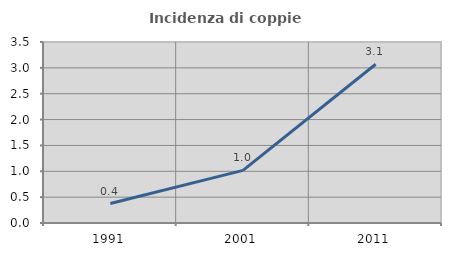
| Category | Incidenza di coppie miste |
|---|---|
| 1991.0 | 0.377 |
| 2001.0 | 1.017 |
| 2011.0 | 3.069 |